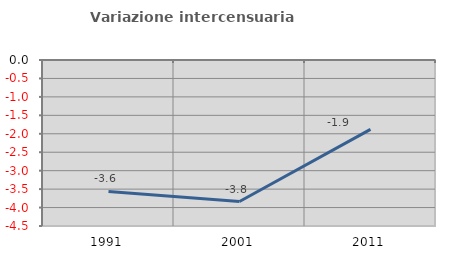
| Category | Variazione intercensuaria annua |
|---|---|
| 1991.0 | -3.564 |
| 2001.0 | -3.836 |
| 2011.0 | -1.881 |